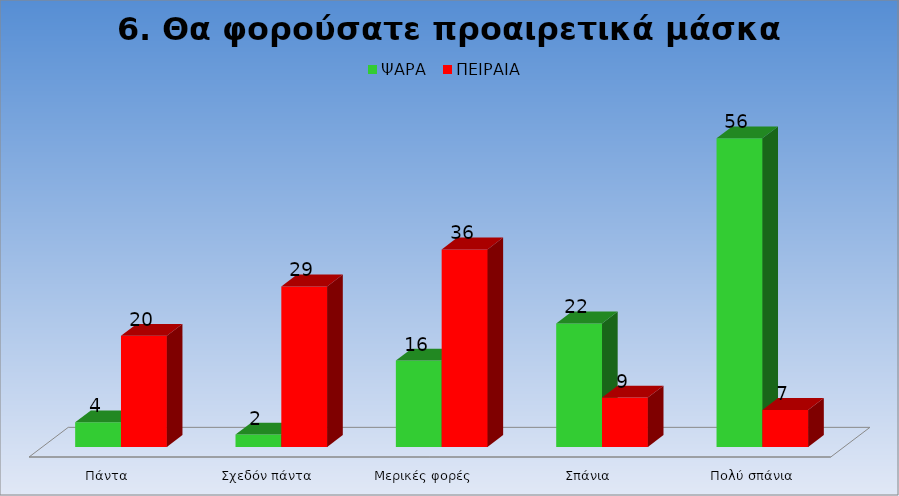
| Category | ΨΑΡΑ  | ΠΕΙΡΑΙΑ  |
|---|---|---|
| Πάντα | 4.444 | 20 |
| Σχεδόν πάντα | 2.222 | 28.889 |
| Μερικές φορές   | 15.556 | 35.556 |
| Σπάνια | 22.222 | 8.889 |
|   Πολύ σπάνια | 55.556 | 6.667 |